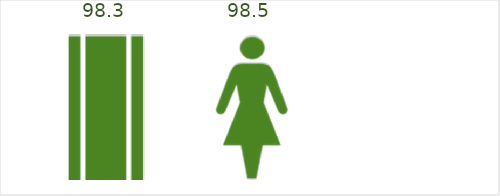
| Category | Series 1 |
|---|---|
| Agriculture | 100 |
| Industry | 100 |